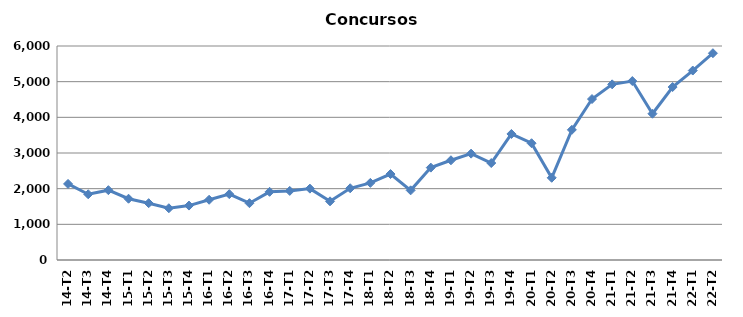
| Category | Concursos |
|---|---|
| 14-T2 | 2133 |
| 14-T3 | 1843 |
| 14-T4 | 1958 |
| 15-T1 | 1718 |
| 15-T2 | 1593 |
| 15-T3 | 1451 |
| 15-T4 | 1526 |
| 16-T1 | 1689 |
| 16-T2 | 1847 |
| 16-T3 | 1593 |
| 16-T4 | 1911 |
| 17-T1 | 1937 |
| 17-T2 | 2001 |
| 17-T3 | 1645 |
| 17-T4 | 2011 |
| 18-T1 | 2162 |
| 18-T2 | 2410 |
| 18-T3 | 1953 |
| 18-T4 | 2590 |
| 19-T1 | 2796 |
| 19-T2 | 2982 |
| 19-T3 | 2719 |
| 19-T4 | 3534 |
| 20-T1 | 3274 |
| 20-T2 | 2305 |
| 20-T3 | 3649 |
| 20-T4 | 4513 |
| 21-T1 | 4925 |
| 21-T2 | 5017 |
| 21-T3 | 4101 |
| 21-T4 | 4849 |
| 22-T1 | 5312 |
| 22-T2 | 5798 |